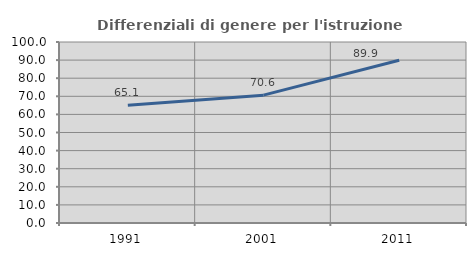
| Category | Differenziali di genere per l'istruzione superiore |
|---|---|
| 1991.0 | 65.067 |
| 2001.0 | 70.638 |
| 2011.0 | 89.943 |